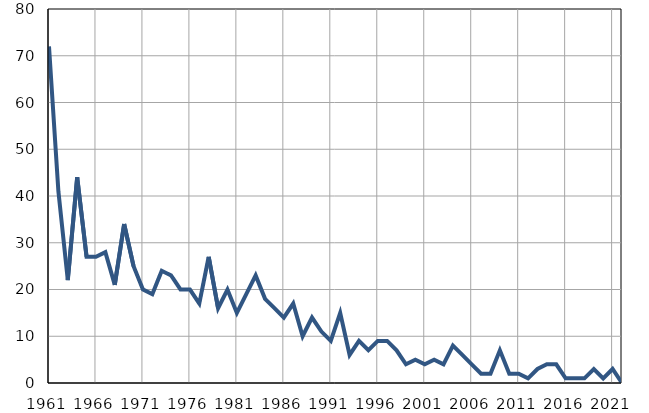
| Category | Умрла 
одојчад |
|---|---|
| 1961.0 | 72 |
| 1962.0 | 41 |
| 1963.0 | 22 |
| 1964.0 | 44 |
| 1965.0 | 27 |
| 1966.0 | 27 |
| 1967.0 | 28 |
| 1968.0 | 21 |
| 1969.0 | 34 |
| 1970.0 | 25 |
| 1971.0 | 20 |
| 1972.0 | 19 |
| 1973.0 | 24 |
| 1974.0 | 23 |
| 1975.0 | 20 |
| 1976.0 | 20 |
| 1977.0 | 17 |
| 1978.0 | 27 |
| 1979.0 | 16 |
| 1980.0 | 20 |
| 1981.0 | 15 |
| 1982.0 | 19 |
| 1983.0 | 23 |
| 1984.0 | 18 |
| 1985.0 | 16 |
| 1986.0 | 14 |
| 1987.0 | 17 |
| 1988.0 | 10 |
| 1989.0 | 14 |
| 1990.0 | 11 |
| 1991.0 | 9 |
| 1992.0 | 15 |
| 1993.0 | 6 |
| 1994.0 | 9 |
| 1995.0 | 7 |
| 1996.0 | 9 |
| 1997.0 | 9 |
| 1998.0 | 7 |
| 1999.0 | 4 |
| 2000.0 | 5 |
| 2001.0 | 4 |
| 2002.0 | 5 |
| 2003.0 | 4 |
| 2004.0 | 8 |
| 2005.0 | 6 |
| 2006.0 | 4 |
| 2007.0 | 2 |
| 2008.0 | 2 |
| 2009.0 | 7 |
| 2010.0 | 2 |
| 2011.0 | 2 |
| 2012.0 | 1 |
| 2013.0 | 3 |
| 2014.0 | 4 |
| 2015.0 | 4 |
| 2016.0 | 1 |
| 2017.0 | 1 |
| 2018.0 | 1 |
| 2019.0 | 3 |
| 2020.0 | 1 |
| 2021.0 | 3 |
| 2022.0 | 0 |